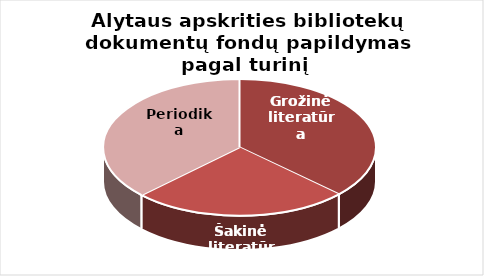
| Category | Series 0 |
|---|---|
| Grožinė literatūra | 17175 |
| Šakinė literatūra | 11908 |
| Periodika | 17288 |